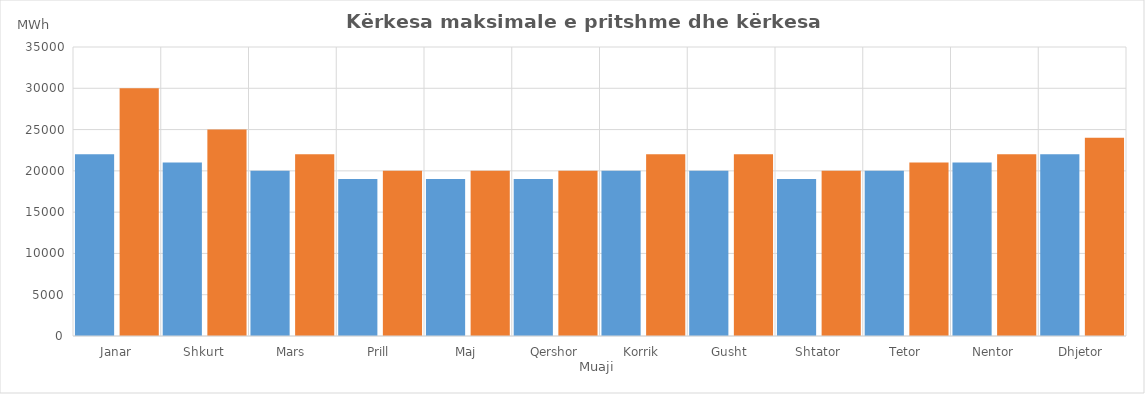
| Category | Ngarkesa Mes. | Ngarkesa Max |
|---|---|---|
| Janar | 22000 | 30000 |
| Shkurt | 21000 | 25000 |
| Mars | 20000 | 22000 |
| Prill | 19000 | 20000 |
| Maj | 19000 | 20000 |
| Qershor | 19000 | 20000 |
| Korrik | 20000 | 22000 |
| Gusht | 20000 | 22000 |
| Shtator | 19000 | 20000 |
| Tetor | 20000 | 21000 |
| Nentor | 21000 | 22000 |
| Dhjetor | 22000 | 24000 |